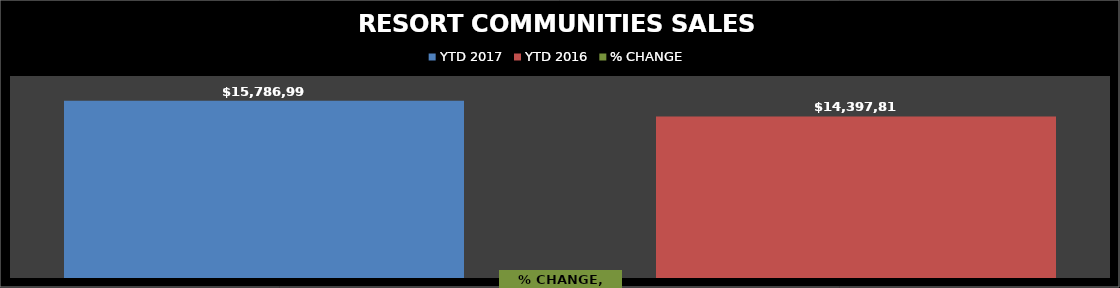
| Category | YTD 2017 | YTD 2016 |
|---|---|---|
| RESORT COMMUNITIES SALES TAX - 2017 | 15786992.36 | 14397812.66 |